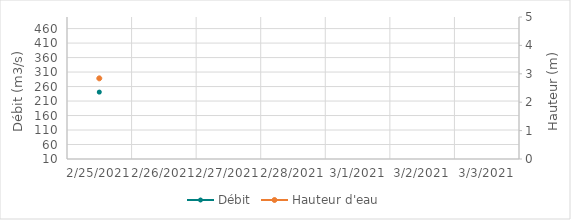
| Category | Débit |
|---|---|
| 2/2/21 | 377.27 |
| 2/1/21 | 317.4 |
| 1/31/21 | 247.43 |
| 1/30/21 | 241.09 |
| 1/29/21 | 245.08 |
| 1/28/21 | 234.52 |
| 1/27/21 | 227.46 |